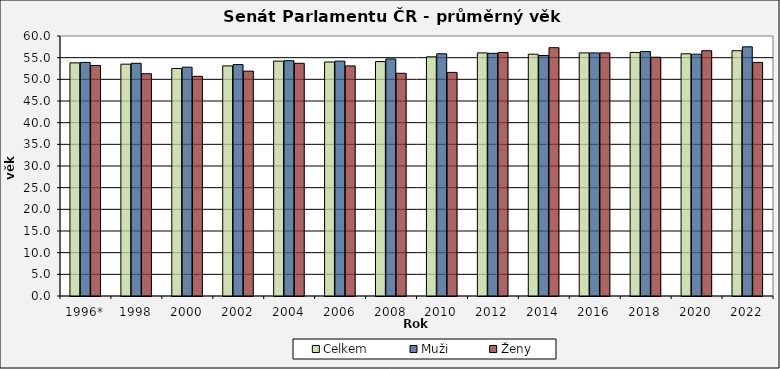
| Category | Celkem | Muži | Ženy |
|---|---|---|---|
| 1996* | 53.8 | 53.9 | 53.2 |
| 1998 | 53.5 | 53.7 | 51.3 |
| 2000 | 52.5 | 52.8 | 50.7 |
| 2002 | 53.1 | 53.4 | 51.9 |
| 2004 | 54.2 | 54.3 | 53.7 |
| 2006 | 54 | 54.2 | 53.1 |
| 2008 | 54.1 | 54.7 | 51.4 |
| 2010 | 55.2 | 55.9 | 51.6 |
| 2012 | 56.1 | 56 | 56.2 |
| 2014 | 55.8 | 55.5 | 57.3 |
| 2016 | 56.1 | 56.1 | 56.1 |
| 2018 | 56.2 | 56.4 | 55.1 |
| 2020 | 55.9 | 55.8 | 56.6 |
| 2022 | 56.6 | 57.5 | 53.9 |